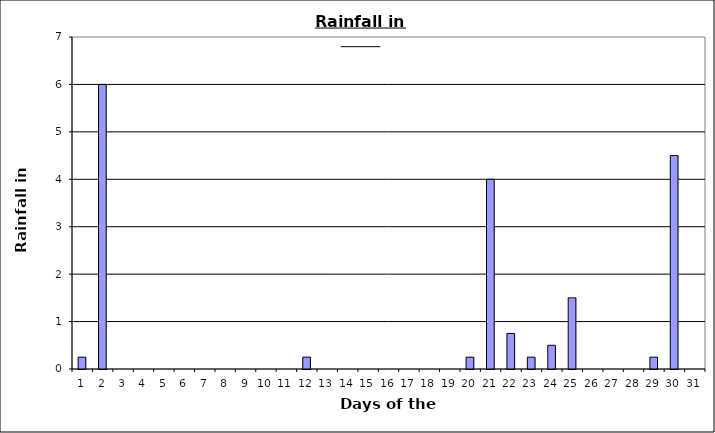
| Category | Series 0 |
|---|---|
| 0 | 0.25 |
| 1 | 6 |
| 2 | 0 |
| 3 | 0 |
| 4 | 0 |
| 5 | 0 |
| 6 | 0 |
| 7 | 0 |
| 8 | 0 |
| 9 | 0 |
| 10 | 0 |
| 11 | 0.25 |
| 12 | 0 |
| 13 | 0 |
| 14 | 0 |
| 15 | 0 |
| 16 | 0 |
| 17 | 0 |
| 18 | 0 |
| 19 | 0.25 |
| 20 | 4 |
| 21 | 0.75 |
| 22 | 0.25 |
| 23 | 0.5 |
| 24 | 1.5 |
| 25 | 0 |
| 26 | 0 |
| 27 | 0 |
| 28 | 0.25 |
| 29 | 4.5 |
| 30 | 0 |